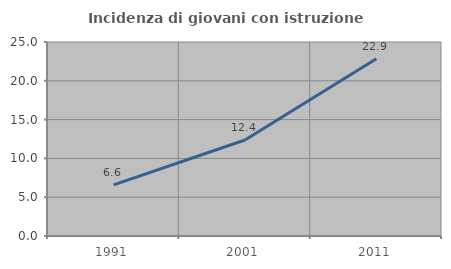
| Category | Incidenza di giovani con istruzione universitaria |
|---|---|
| 1991.0 | 6.593 |
| 2001.0 | 12.366 |
| 2011.0 | 22.852 |